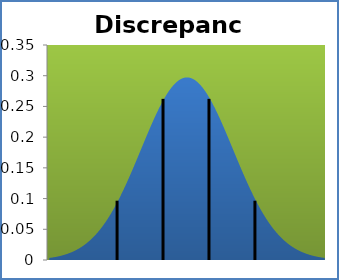
| Category | densité |
|---|---|
| -0.33600000000000074 | 0.003 |
| -0.2689000000000008 | 0.004 |
| -0.20179999999999998 | 0.004 |
| -0.13470000000000004 | 0.005 |
| -0.0676000000000001 | 0.006 |
| -0.000500000000000167 | 0.007 |
| 0.06659999999999977 | 0.008 |
| 0.1336999999999997 | 0.009 |
| 0.20079999999999965 | 0.01 |
| 0.2678999999999996 | 0.012 |
| 0.3349999999999995 | 0.013 |
| 0.40209999999999946 | 0.015 |
| 0.4692000000000003 | 0.017 |
| 0.5362999999999998 | 0.019 |
| 0.6033999999999997 | 0.021 |
| 0.6705000000000001 | 0.024 |
| 0.7376 | 0.026 |
| 0.8047 | 0.029 |
| 0.8717999999999999 | 0.033 |
| 0.9388999999999998 | 0.036 |
| 1.0059999999999998 | 0.04 |
| 1.0730999999999997 | 0.044 |
| 1.1401999999999997 | 0.049 |
| 1.2072999999999996 | 0.054 |
| 1.2743999999999995 | 0.059 |
| 1.3414999999999995 | 0.064 |
| 1.4085999999999999 | 0.07 |
| 1.4756999999999998 | 0.076 |
| 1.5427999999999997 | 0.083 |
| 1.6098999999999997 | 0.089 |
| 1.6769999999999996 | 0.097 |
| 1.7441 | 0.104 |
| 1.8112 | 0.112 |
| 1.8782999999999999 | 0.12 |
| 1.9453999999999998 | 0.128 |
| 2.0124999999999997 | 0.136 |
| 2.0796 | 0.145 |
| 2.1467 | 0.153 |
| 2.2138 | 0.162 |
| 2.2809 | 0.171 |
| 2.348 | 0.18 |
| 2.4151 | 0.189 |
| 2.4821999999999997 | 0.198 |
| 2.5492999999999997 | 0.207 |
| 2.6163999999999996 | 0.216 |
| 2.6834999999999996 | 0.224 |
| 2.7506 | 0.233 |
| 2.8177 | 0.241 |
| 2.8848000000000003 | 0.248 |
| 2.9519 | 0.256 |
| 3.019 | 0.262 |
| 3.0861 | 0.269 |
| 3.1532 | 0.274 |
| 3.2203 | 0.28 |
| 3.2874 | 0.284 |
| 3.3545 | 0.288 |
| 3.4215999999999998 | 0.291 |
| 3.4887 | 0.294 |
| 3.5558 | 0.296 |
| 3.6229 | 0.297 |
| 3.69 | 0.297 |
| 3.7571 | 0.297 |
| 3.8242 | 0.296 |
| 3.8912999999999998 | 0.294 |
| 3.9584 | 0.291 |
| 4.0255 | 0.288 |
| 4.0926 | 0.284 |
| 4.1597 | 0.28 |
| 4.2268 | 0.274 |
| 4.2939 | 0.269 |
| 4.361 | 0.262 |
| 4.4281 | 0.256 |
| 4.4952 | 0.248 |
| 4.5623000000000005 | 0.241 |
| 4.6294 | 0.233 |
| 4.6965 | 0.224 |
| 4.7636 | 0.216 |
| 4.8307 | 0.207 |
| 4.8978 | 0.198 |
| 4.9649 | 0.189 |
| 5.032 | 0.18 |
| 5.0991 | 0.171 |
| 5.1662 | 0.162 |
| 5.2333 | 0.153 |
| 5.3004 | 0.145 |
| 5.3675 | 0.136 |
| 5.4346 | 0.128 |
| 5.5017 | 0.12 |
| 5.5687999999999995 | 0.112 |
| 5.6358999999999995 | 0.104 |
| 5.703 | 0.097 |
| 5.7701 | 0.089 |
| 5.8372 | 0.083 |
| 5.9043 | 0.076 |
| 5.9714 | 0.07 |
| 6.038500000000001 | 0.064 |
| 6.105600000000001 | 0.059 |
| 6.172700000000001 | 0.054 |
| 6.239800000000001 | 0.049 |
| 6.306900000000001 | 0.044 |
| 6.3740000000000006 | 0.04 |
| 6.4411000000000005 | 0.036 |
| 6.5082 | 0.033 |
| 6.5753 | 0.029 |
| 6.6424 | 0.026 |
| 6.7095 | 0.024 |
| 6.7766 | 0.021 |
| 6.8437 | 0.019 |
| 6.9108 | 0.017 |
| 6.9779 | 0.015 |
| 7.045 | 0.013 |
| 7.1121 | 0.012 |
| 7.1792 | 0.01 |
| 7.2463 | 0.009 |
| 7.3134 | 0.008 |
| 7.3805 | 0.007 |
| 7.4475999999999996 | 0.006 |
| 7.5146999999999995 | 0.005 |
| 7.581799999999999 | 0.004 |
| 7.648900000000001 | 0.004 |
| 7.716000000000001 | 0.003 |